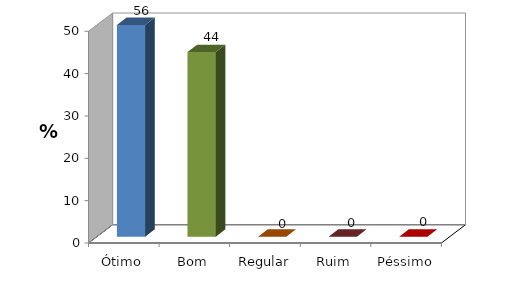
| Category | Series 0 |
|---|---|
| Ótimo | 56.41 |
| Bom | 43.59 |
| Regular | 0 |
| Ruim | 0 |
| Péssimo | 0 |